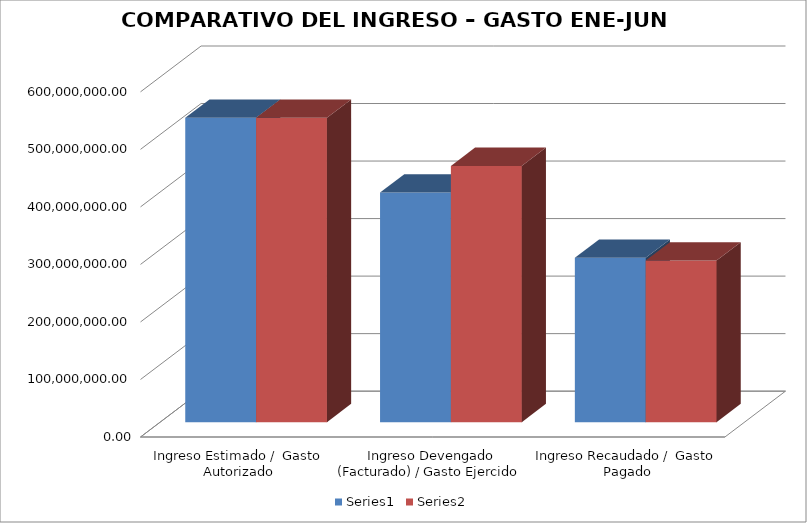
| Category | Series 0 | Series 1 |
|---|---|---|
| Ingreso Estimado /  Gasto Autorizado | 529043246.36 | 529043246.36 |
| Ingreso Devengado (Facturado) / Gasto Ejercido  | 399193228.29 | 445369758.77 |
| Ingreso Recaudado /  Gasto Pagado | 285837858.83 | 280870247.41 |